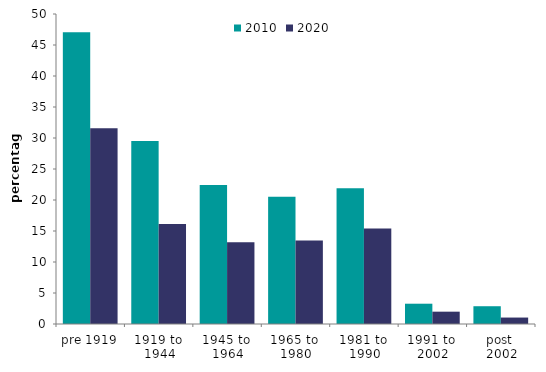
| Category | 2010 | 2020 |
|---|---|---|
| pre 1919 | 47.042 | 31.574 |
| 1919 to 
1944 | 29.515 | 16.119 |
| 1945 to 
1964 | 22.43 | 13.176 |
| 1965 to 
1980 | 20.53 | 13.473 |
| 1981 to 
1990 | 21.904 | 15.401 |
| 1991 to 
2002 | 3.273 | 1.988 |
| post 
2002 | 2.867 | 1.04 |